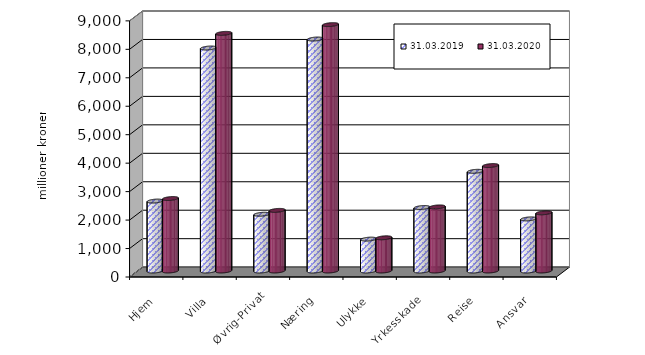
| Category | 31.03.2019 | 31.03.2020 |
|---|---|---|
| Hjem | 2457.488 | 2546.317 |
| Villa | 7835.445 | 8349.885 |
| Øvrig-Privat | 1994.191 | 2129.668 |
| Næring | 8151.604 | 8657.609 |
| Ulykke | 1119.974 | 1166.647 |
| Yrkesskade | 2231.073 | 2251.755 |
| Reise | 3502.886 | 3704.966 |
| Ansvar | 1831.367 | 2044.178 |